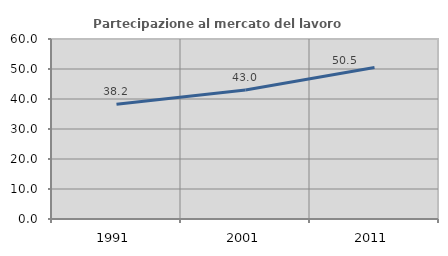
| Category | Partecipazione al mercato del lavoro  femminile |
|---|---|
| 1991.0 | 38.245 |
| 2001.0 | 42.995 |
| 2011.0 | 50.516 |